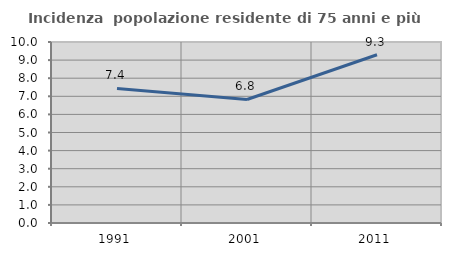
| Category | Incidenza  popolazione residente di 75 anni e più |
|---|---|
| 1991.0 | 7.432 |
| 2001.0 | 6.825 |
| 2011.0 | 9.298 |